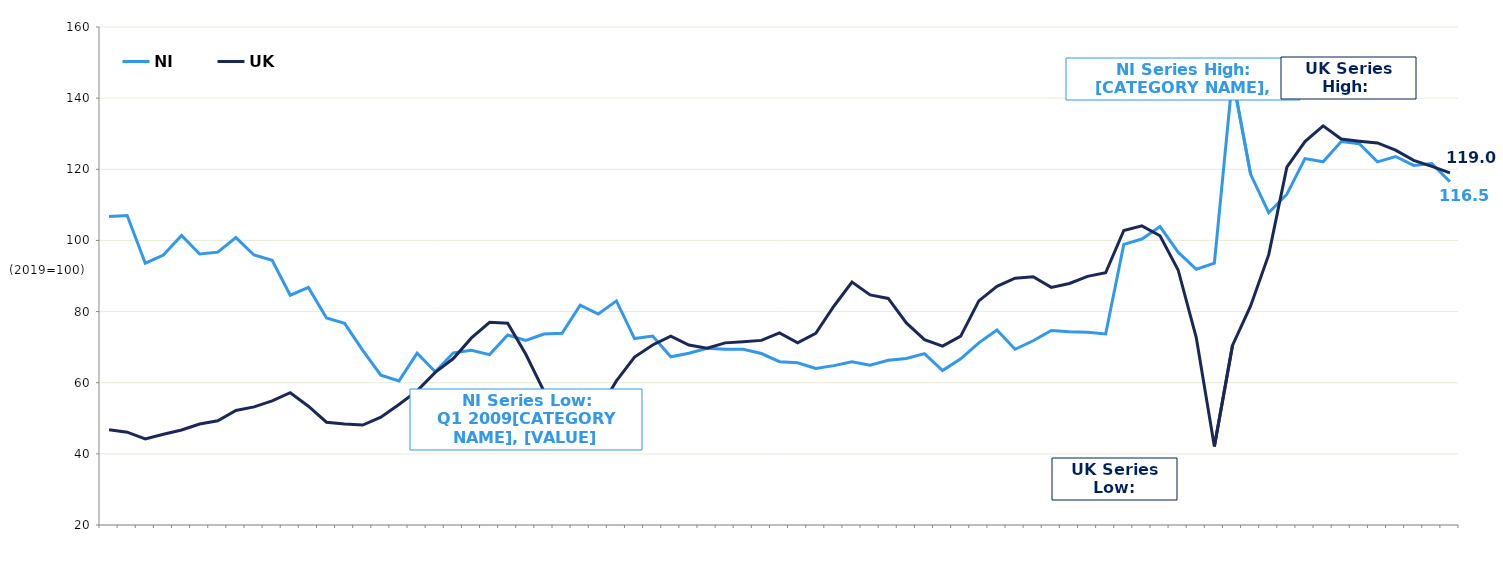
| Category | NI | UK  |
|---|---|---|
|  | 106.7 | 46.8 |
|  | 107 | 46.1 |
| Q3 2005 | 93.6 | 44.2 |
|  | 95.9 | 45.5 |
|  | 101.4 | 46.7 |
|  | 96.2 | 48.4 |
| Q3 2006 | 96.7 | 49.3 |
|  | 100.8 | 52.2 |
|  | 95.9 | 53.2 |
|  | 94.4 | 54.9 |
| Q3 2007 | 84.6 | 57.2 |
|  | 86.8 | 53.4 |
|  | 78.2 | 48.9 |
|  | 76.7 | 48.4 |
| Q3 2008 | 69.1 | 48.1 |
|  | 62.1 | 50.3 |
|  | 60.5 | 53.9 |
|  | 68.3 | 57.7 |
| Q3 2009 | 63.1 | 62.9 |
|  | 68.4 | 66.8 |
|  | 69.1 | 72.6 |
|  | 67.9 | 77 |
| Q3 2010 | 73.4 | 76.7 |
|  | 71.9 | 68 |
|  | 73.7 | 57.6 |
|  | 73.9 | 51.4 |
| Q3 2011 | 81.8 | 48.3 |
|  | 79.3 | 52.1 |
|  | 83 | 60.5 |
|  | 72.4 | 67.2 |
| Q3 2012 | 73.1 | 70.6 |
|  | 67.3 | 73.1 |
|  | 68.3 | 70.6 |
|  | 69.7 | 69.7 |
| Q3 2013 | 69.4 | 71.2 |
|  | 69.4 | 71.5 |
|  | 68.2 | 71.9 |
|  | 65.9 | 74 |
| Q3 2014 | 65.6 | 71.2 |
|  | 64 | 73.9 |
|  | 64.8 | 81.5 |
|  | 65.9 | 88.3 |
| Q3 2015 | 64.9 | 84.7 |
|  | 66.3 | 83.7 |
|  | 66.8 | 76.8 |
|  | 68.2 | 72.1 |
| Q3 2016 | 63.4 | 70.3 |
|  | 66.7 | 73.1 |
|  | 71.2 | 83 |
|  | 74.8 | 87.1 |
| Q3 2017 | 69.4 | 89.4 |
|  | 71.8 | 89.8 |
|  | 74.7 | 86.8 |
|  | 74.3 | 87.9 |
| Q3 2018 | 74.2 | 89.9 |
|  | 73.7 | 90.9 |
|  | 98.9 | 102.8 |
|  | 100.4 | 104.1 |
| Q3 2019 | 103.9 | 101.3 |
|  | 96.7 | 91.7 |
|  | 91.9 | 72.7 |
|  | 93.6 | 42.1 |
| Q3 2020 | 145.9 | 70.5 |
|  | 118.6 | 81.6 |
|  | 107.8 | 96 |
|  | 113 | 120.6 |
| Q3 2021 | 123 | 127.8 |
|  | 122.1 | 132.2 |
|  | 127.8 | 128.5 |
|  | 127.2 | 127.9 |
| Q3 2022 | 122.1 | 127.4 |
|  | 123.6 | 125.4 |
|  | 121.1 | 122.5 |
|  | 121.6 | 120.8 |
| Q3 2023 | 116.5 | 119 |